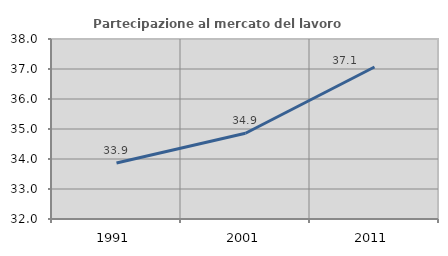
| Category | Partecipazione al mercato del lavoro  femminile |
|---|---|
| 1991.0 | 33.869 |
| 2001.0 | 34.86 |
| 2011.0 | 37.066 |